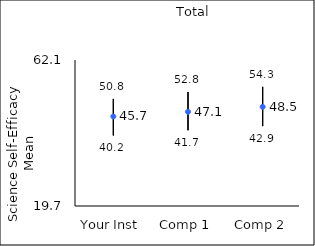
| Category | 25th percentile | 75th percentile | Mean |
|---|---|---|---|
| Your Inst | 40.2 | 50.8 | 45.7 |
| Comp 1 | 41.7 | 52.8 | 47.05 |
| Comp 2 | 42.9 | 54.3 | 48.5 |